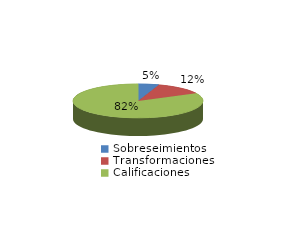
| Category | Series 0 |
|---|---|
| Sobreseimientos | 50 |
| Transformaciones | 120 |
| Calificaciones | 801 |